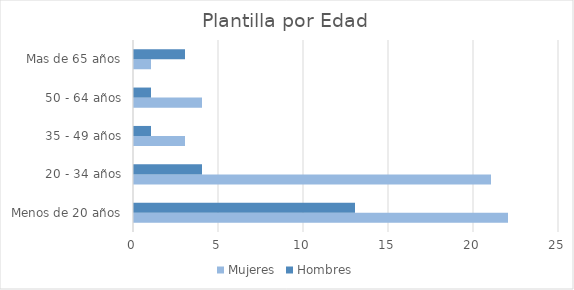
| Category | Mujeres | Hombres |
|---|---|---|
| Menos de 20 años | 22 | 13 |
| 20 - 34 años | 21 | 4 |
| 35 - 49 años | 3 | 1 |
| 50 - 64 años | 4 | 1 |
| Mas de 65 años | 1 | 3 |